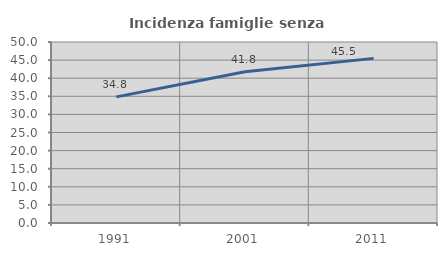
| Category | Incidenza famiglie senza nuclei |
|---|---|
| 1991.0 | 34.84 |
| 2001.0 | 41.766 |
| 2011.0 | 45.477 |